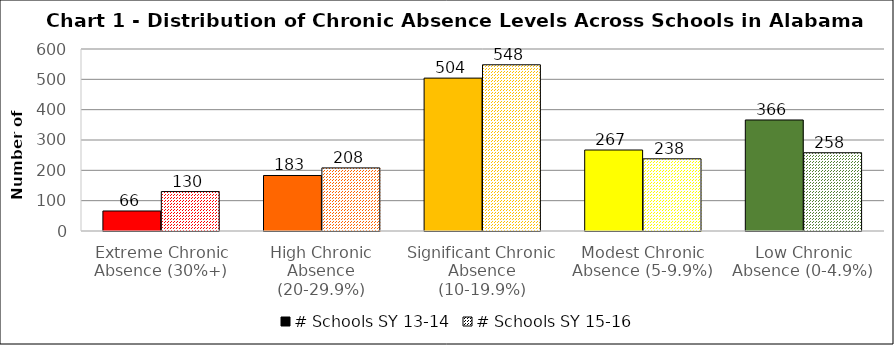
| Category | # Schools SY 13-14 | # Schools SY 15-16 |
|---|---|---|
| Extreme Chronic Absence (30%+) | 66 | 130 |
| High Chronic Absence (20-29.9%) | 183 | 208 |
| Significant Chronic Absence (10-19.9%) | 504 | 548 |
| Modest Chronic Absence (5-9.9%) | 267 | 238 |
| Low Chronic Absence (0-4.9%) | 366 | 258 |